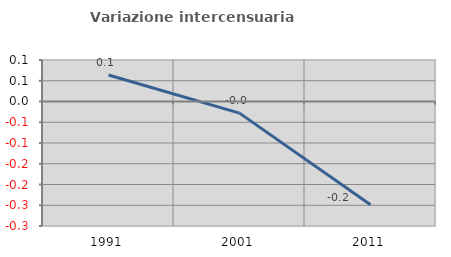
| Category | Variazione intercensuaria annua |
|---|---|
| 1991.0 | 0.064 |
| 2001.0 | -0.028 |
| 2011.0 | -0.249 |